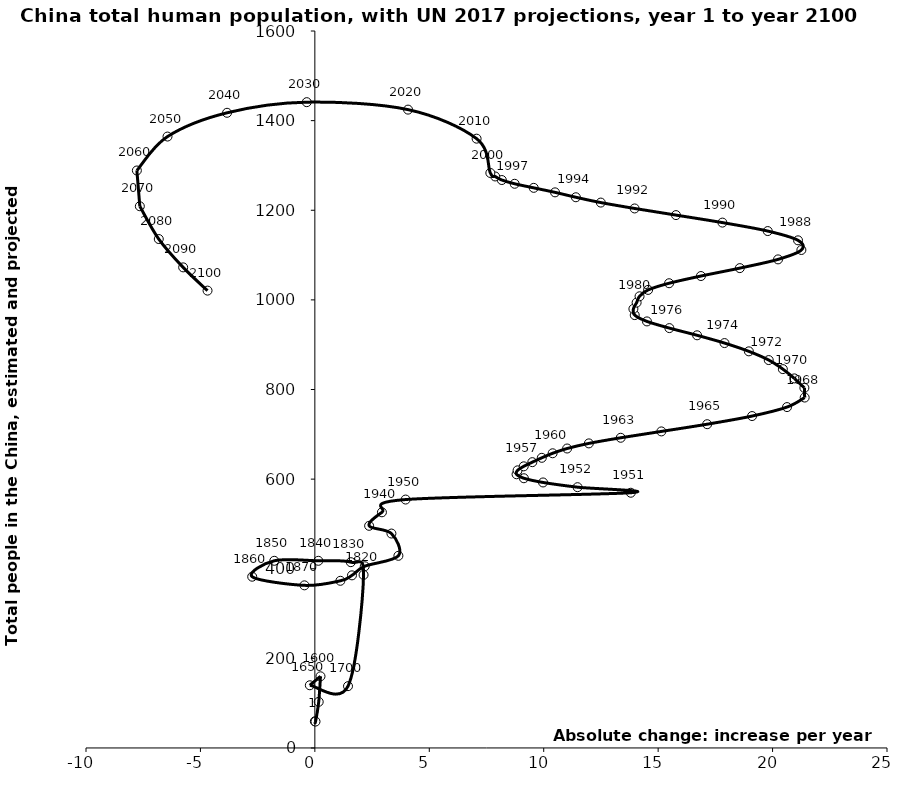
| Category | Series 0 |
|---|---|
| -0.0006000000000000015 | 59.6 |
| 0.02895263509006004 | 59 |
| 0.16833333333333333 | 103 |
| 0.24666666666666667 | 160 |
| -0.22 | 140 |
| 1.448812820337667 | 138 |
| 2.128365745973712 | 386.298 |
| 1.571554273383137 | 414.688 |
| 0.15208589742417472 | 417.729 |
| -1.7743354699487042 | 417.729 |
| -2.7375461536351424 | 382.243 |
| -0.4562576922725242 | 362.978 |
| 1.1152965811106128 | 373.117 |
| 1.6222495725245296 | 385.284 |
| 2.179897863079836 | 405.562 |
| 3.650061538180188 | 428.882 |
| 3.3458897433318384 | 478.564 |
| 2.3710191408428782 | 495.8 |
| 2.9309624698595487 | 525.984 |
| 3.9660971171278705 | 554.419 |
| 13.80501300000003 | 569.611 |
| 11.478392999999983 | 582.029 |
| 9.970958499999995 | 592.568 |
| 9.133267499999988 | 601.971 |
| 8.81316449999997 | 610.834 |
| 8.858504500000038 | 619.598 |
| 9.128031000000021 | 628.551 |
| 9.502278999999987 | 637.854 |
| 9.916267000000005 | 647.556 |
| 10.389466999999968 | 657.686 |
| 11.023085999999978 | 668.335 |
| 11.972796500000015 | 679.732 |
| 13.364319000000023 | 692.28 |
| 15.14084650000001 | 706.461 |
| 17.14234449999998 | 722.562 |
| 19.10444000000001 | 740.746 |
| 20.63154350000002 | 760.771 |
| 21.40307899999999 | 782.009 |
| 21.38986399999999 | 803.577 |
| 20.952178500000002 | 824.788 |
| 20.449036499999977 | 845.482 |
| 19.8321775 | 865.687 |
| 18.963504 | 885.146 |
| 17.89957499999997 | 903.614 |
| 16.702357000000006 | 920.945 |
| 15.491180500000041 | 937.018 |
| 14.510784999999998 | 951.927 |
| 13.976587499999994 | 966.04 |
| 13.918744000000004 | 979.881 |
| 14.059766499999967 | 993.877 |
| 14.188042999999993 | 1008 |
| 14.561841000000015 | 1022.253 |
| 15.47866950000008 | 1037.124 |
| 16.869777500000055 | 1053.211 |
| 18.568660499999964 | 1070.863 |
| 20.23916799999995 | 1090.348 |
| 21.259143999999992 | 1111.342 |
| 21.112084500000037 | 1132.866 |
| 19.789428000000044 | 1153.566 |
| 17.808813999999984 | 1172.445 |
| 15.779350499999964 | 1189.184 |
| 13.972805499999936 | 1204.004 |
| 12.494015499999932 | 1217.129 |
| 11.405435500000067 | 1228.992 |
| 10.494754499999999 | 1239.94 |
| 9.563485000000014 | 1249.981 |
| 8.730031000000054 | 1259.067 |
| 8.169862499999908 | 1267.442 |
| 7.878733499999953 | 1275.407 |
| 7.668036636363653 | 1283.199 |
| 7.067464800000005 | 1359.755 |
| 4.071335549999992 | 1424.548 |
| -0.35377260000000205 | 1441.182 |
| -3.8362544999999955 | 1417.473 |
| -6.43831285 | 1364.457 |
| -7.7773948000000015 | 1288.707 |
| -7.647617000000002 | 1208.909 |
| -6.819511550000004 | 1135.754 |
| -5.754450049999997 | 1072.519 |
| -4.6893885499999906 | 1020.665 |